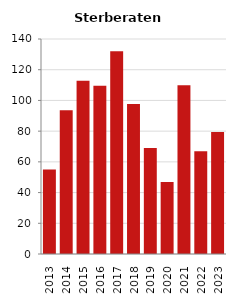
| Category | Sterberate der Bevölkerung ab 80 Jahre (auf Tsd.) |
|---|---|
| 2013.0 | 55 |
| 2014.0 | 93.596 |
| 2015.0 | 112.745 |
| 2016.0 | 109.524 |
| 2017.0 | 132.075 |
| 2018.0 | 97.674 |
| 2019.0 | 68.966 |
| 2020.0 | 46.875 |
| 2021.0 | 109.804 |
| 2022.0 | 66.929 |
| 2023.0 | 79.365 |